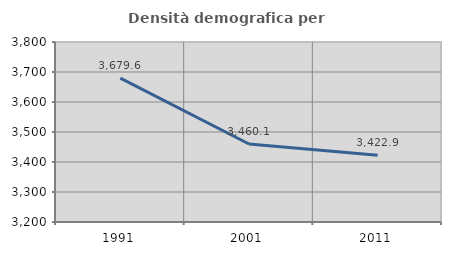
| Category | Densità demografica |
|---|---|
| 1991.0 | 3679.581 |
| 2001.0 | 3460.116 |
| 2011.0 | 3422.884 |